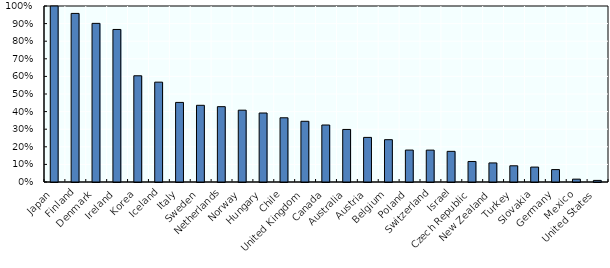
| Category | sh_job_creation |
|---|---|
| Japan | 100 |
| Finland | 95.785 |
| Denmark | 90.136 |
| Ireland | 86.674 |
| Korea | 60.354 |
| Iceland | 56.731 |
| Italy | 45.223 |
| Sweden | 43.58 |
| Netherlands | 42.805 |
| Norway | 40.807 |
| Hungary | 39.2 |
| Chile | 36.482 |
| United Kingdom | 34.494 |
| Canada | 32.383 |
| Australia | 29.864 |
| Austria | 25.342 |
| Belgium | 24.047 |
| Poland | 18.137 |
| Switzerland | 18.111 |
| Israel | 17.417 |
| Czech Republic | 11.662 |
| New Zealand | 10.832 |
| Turkey | 9.208 |
| Slovakia | 8.478 |
| Germany | 7.053 |
| Mexico | 1.621 |
| United States | 0.907 |